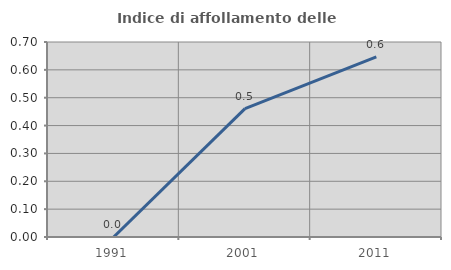
| Category | Indice di affollamento delle abitazioni  |
|---|---|
| 1991.0 | 0 |
| 2001.0 | 0.461 |
| 2011.0 | 0.647 |